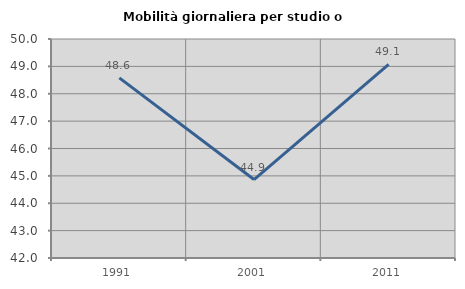
| Category | Mobilità giornaliera per studio o lavoro |
|---|---|
| 1991.0 | 48.582 |
| 2001.0 | 44.866 |
| 2011.0 | 49.074 |